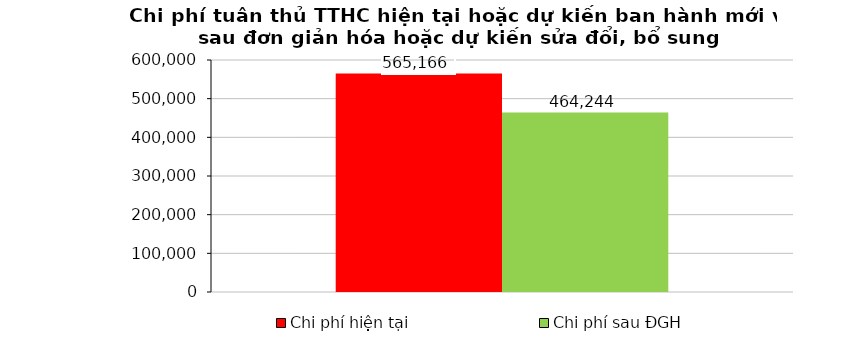
| Category | Chi phí hiện tại | Chi phí sau ĐGH |
|---|---|---|
| 0 | 565166 | 464243.5 |